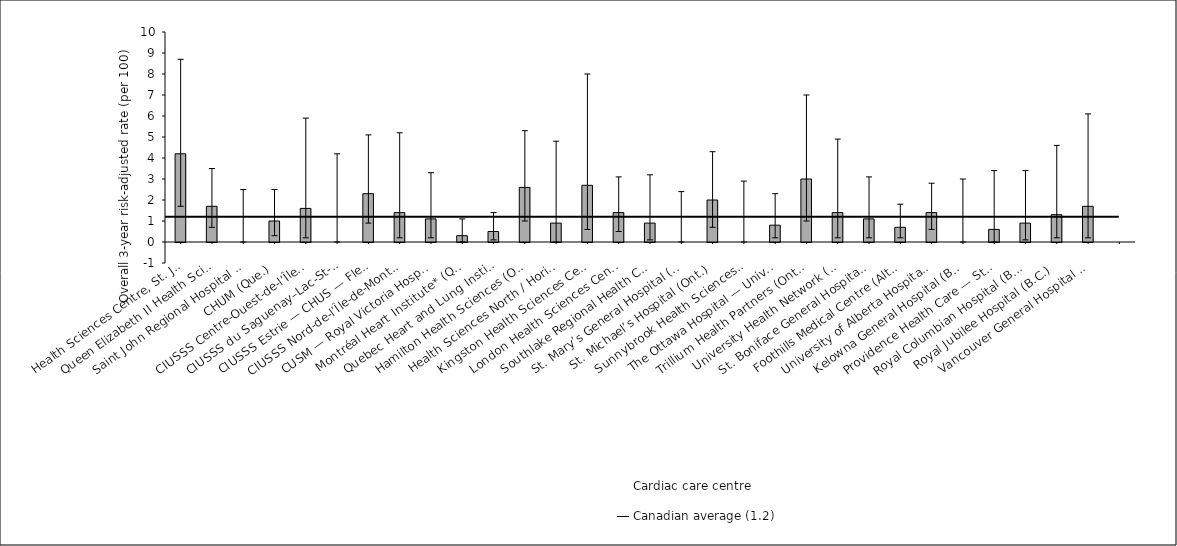
| Category | Risk-adjusted rate |
|---|---|
| Health Sciences Centre, St. John’s* (N.L.) | 4.2 |
| Queen Elizabeth II Health Sciences Centre (N.S.) | 1.7 |
| Saint John Regional Hospital (N.B.) | 0 |
| CHUM (Que.) | 1 |
| CIUSSS Centre-Ouest-de-l’Île-de-Montréal — Jewish General Hospital (Que.) | 1.6 |
| CIUSSS du Saguenay–Lac-St-Jean — Chicoutimi Hospital (Que.) | 0 |
| CIUSSS Estrie — CHUS — Fleurimont Hospital (Que.) | 2.3 |
| CIUSSS Nord-de-l’Île-de-Montréal — Montréal Sacré-Coeur Hospital (Que.) | 1.4 |
| CUSM — Royal Victoria Hospital (Que.) | 1.1 |
| Montréal Heart Institute* (Que.) | 0.3 |
| Quebec Heart and Lung Institute (Que.) | 0.5 |
| Hamilton Health Sciences (Ont.) | 2.6 |
| Health Sciences North / Horizon Santé-Nord (Ont.) | 0.9 |
| Kingston Health Sciences Centre (Ont.) | 2.7 |
| London Health Sciences Centre (Ont.) | 1.4 |
| Southlake Regional Health Centre (Ont.) | 0.9 |
| St. Mary’s General Hospital (Ont.) | 0 |
| St. Michael’s Hospital (Ont.) | 2 |
| Sunnybrook Health Sciences Centre (Ont.) | 0 |
| The Ottawa Hospital — University of Ottawa Heart Institute (Ont.) | 0.8 |
| Trillium Health Partners (Ont.) | 3 |
| University Health Network (Ont.) | 1.4 |
| St. Boniface General Hospital (Man.) | 1.1 |
| Foothills Medical Centre (Alta.) | 0.7 |
| University of Alberta Hospital (Alta.) | 1.4 |
| Kelowna General Hospital (B.C.) | 0 |
| Providence Health Care — St. Paul’s Hospital (Vancouver) (B.C.) | 0.6 |
| Royal Columbian Hospital (B.C.) | 0.9 |
| Royal Jubilee Hospital (B.C.) | 1.3 |
| Vancouver General Hospital (B.C.) | 1.7 |